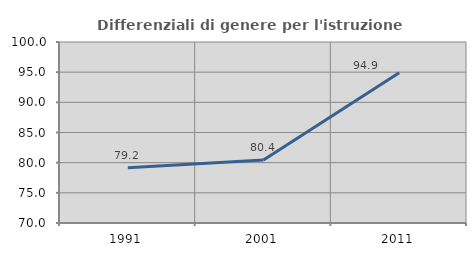
| Category | Differenziali di genere per l'istruzione superiore |
|---|---|
| 1991.0 | 79.167 |
| 2001.0 | 80.426 |
| 2011.0 | 94.921 |